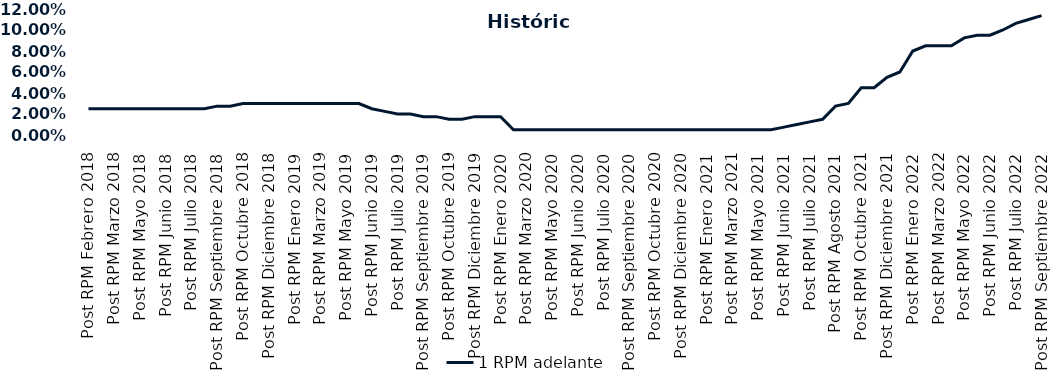
| Category | 1 RPM adelante |
|---|---|
| Post RPM Febrero 2018 | 0.025 |
| Pre RPM Marzo 2018 | 0.025 |
| Post RPM Marzo 2018 | 0.025 |
| Pre RPM Mayo 2018 | 0.025 |
| Post RPM Mayo 2018 | 0.025 |
| Pre RPM Junio 2018 | 0.025 |
| Post RPM Junio 2018 | 0.025 |
| Pre RPM Julio 2018 | 0.025 |
| Post RPM Julio 2018 | 0.025 |
| Pre RPM Septiembre 2018 | 0.025 |
| Post RPM Septiembre 2018 | 0.028 |
| Pre RPM Octubre 2018 | 0.028 |
| Post RPM Octubre 2018 | 0.03 |
| Pre RPM Diciembre 2018 | 0.03 |
| Post RPM Diciembre 2018 | 0.03 |
| Pre RPM Enero 2019 | 0.03 |
| Post RPM Enero 2019 | 0.03 |
| Pre RPM Marzo 2019 | 0.03 |
| Post RPM Marzo 2019 | 0.03 |
| Pre RPM Mayo 2019 | 0.03 |
| Post RPM Mayo 2019 | 0.03 |
| Pre RPM Junio 2019 | 0.03 |
| Post RPM Junio 2019 | 0.025 |
| Pre RPM Julio 2019 | 0.022 |
| Post RPM Julio 2019 | 0.02 |
| Pre RPM Septiembre 2019 | 0.02 |
| Post RPM Septiembre 2019 | 0.018 |
| Pre RPM Octubre 2019 | 0.018 |
| Post RPM Octubre 2019 | 0.015 |
| Pre RPM Diciembre 2019 | 0.015 |
| Post RPM Diciembre 2019 | 0.018 |
| Pre RPM Enero 2020 | 0.018 |
| Post RPM Enero 2020 | 0.018 |
| Pre RPM Marzo 2020 | 0.005 |
| Post RPM Marzo 2020 | 0.005 |
| Pre RPM Mayo 2020 | 0.005 |
| Post RPM Mayo 2020 | 0.005 |
| Pre RPM Junio 2020 | 0.005 |
| Post RPM Junio 2020 | 0.005 |
| Pre RPM Julio 2020 | 0.005 |
| Post RPM Julio 2020 | 0.005 |
| Pre RPM Septiembre 2020 | 0.005 |
| Post RPM Septiembre 2020 | 0.005 |
| Pre RPM Octubre 2020 | 0.005 |
| Post RPM Octubre 2020 | 0.005 |
| Pre RPM Diciembre 2020 | 0.005 |
| Post RPM Diciembre 2020 | 0.005 |
| Pre RPM Enero 2021 | 0.005 |
| Post RPM Enero 2021 | 0.005 |
| Pre RPM Marzo 2021 | 0.005 |
| Post RPM Marzo 2021 | 0.005 |
| Pre RPM Mayo 2021 | 0.005 |
| Post RPM Mayo 2021 | 0.005 |
| Pre RPM Junio 2021 | 0.005 |
| Post RPM Junio 2021 | 0.008 |
| Pre RPM Julio 2021 | 0.01 |
| Post RPM Julio 2021 | 0.012 |
| Pre RPM Agosto 2021 | 0.015 |
| Post RPM Agosto 2021 | 0.028 |
| Pre RPM Octubre 2021 | 0.03 |
| Post RPM Octubre 2021 | 0.045 |
| Pre RPM Diciembre 2021 | 0.045 |
| Post RPM Diciembre 2021 | 0.055 |
| Pre RPM Enero 2022 | 0.06 |
| Post RPM Enero 2022 | 0.08 |
| Pre RPM Marzo 2022 | 0.085 |
| Post RPM Marzo 2022 | 0.085 |
| Pre RPM Mayo 2022 | 0.085 |
| Post RPM Mayo 2022 | 0.092 |
| Pre RPM Junio 2022 | 0.095 |
| Post RPM Junio 2022 | 0.095 |
| Pre RPM Julio 2022 | 0.1 |
| Post RPM Julio 2022 | 0.106 |
| Pre RPM Septiembre 2022 | 0.11 |
| Post RPM Septiembre 2022 | 0.114 |